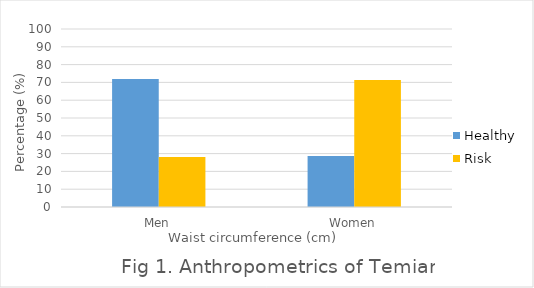
| Category | Healthy | Risk |
|---|---|---|
| Men | 71.9 | 28.1 |
| Women | 28.6 | 71.4 |